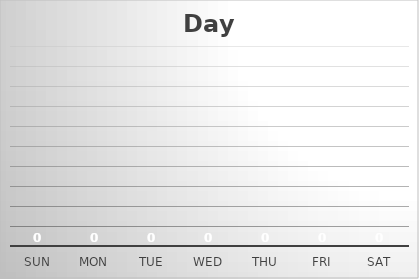
| Category | Day |
|---|---|
| Sun | 0 |
| Mon | 0 |
| Tue | 0 |
| Wed | 0 |
| Thu | 0 |
| Fri | 0 |
| Sat | 0 |